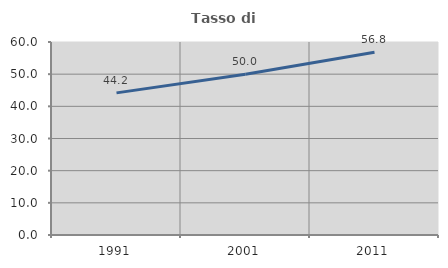
| Category | Tasso di occupazione   |
|---|---|
| 1991.0 | 44.186 |
| 2001.0 | 50 |
| 2011.0 | 56.793 |